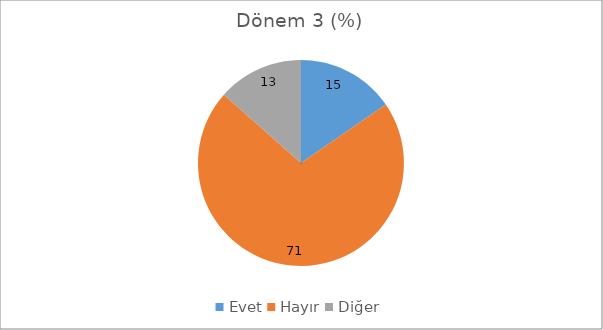
| Category | Dönem 3 (%) | Dönem 1 (%) |
|---|---|---|
| Evet | 15.385 | 6.14 |
| Hayır | 71.154 | 83.333 |
| Diğer | 13.462 | 10.526 |